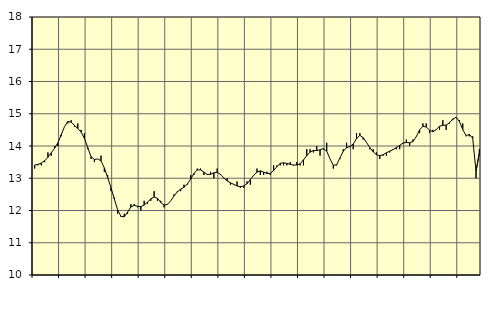
| Category | Piggar | Handel, SNI 45-47 |
|---|---|---|
| nan | 13.3 | 13.41 |
| 87.0 | 13.4 | 13.43 |
| 87.0 | 13.4 | 13.47 |
| 87.0 | 13.5 | 13.54 |
| nan | 13.8 | 13.65 |
| 88.0 | 13.7 | 13.79 |
| 88.0 | 14 | 13.93 |
| 88.0 | 14 | 14.1 |
| nan | 14.3 | 14.35 |
| 89.0 | 14.6 | 14.6 |
| 89.0 | 14.7 | 14.76 |
| 89.0 | 14.8 | 14.74 |
| nan | 14.6 | 14.64 |
| 90.0 | 14.7 | 14.54 |
| 90.0 | 14.5 | 14.43 |
| 90.0 | 14.4 | 14.24 |
| nan | 13.9 | 13.95 |
| 91.0 | 13.6 | 13.67 |
| 91.0 | 13.5 | 13.58 |
| 91.0 | 13.6 | 13.6 |
| nan | 13.7 | 13.54 |
| 92.0 | 13.2 | 13.32 |
| 92.0 | 13.1 | 13.02 |
| 92.0 | 12.6 | 12.71 |
| nan | 12.4 | 12.36 |
| 93.0 | 11.9 | 12.02 |
| 93.0 | 11.8 | 11.82 |
| 93.0 | 11.9 | 11.8 |
| nan | 11.9 | 11.95 |
| 94.0 | 12.2 | 12.11 |
| 94.0 | 12.2 | 12.16 |
| 94.0 | 12.1 | 12.13 |
| nan | 12 | 12.12 |
| 95.0 | 12.3 | 12.17 |
| 95.0 | 12.2 | 12.26 |
| 95.0 | 12.3 | 12.36 |
| nan | 12.6 | 12.42 |
| 96.0 | 12.3 | 12.38 |
| 96.0 | 12.3 | 12.25 |
| 96.0 | 12.1 | 12.17 |
| nan | 12.2 | 12.19 |
| 97.0 | 12.3 | 12.3 |
| 97.0 | 12.5 | 12.45 |
| 97.0 | 12.6 | 12.58 |
| nan | 12.6 | 12.66 |
| 98.0 | 12.8 | 12.72 |
| 98.0 | 12.8 | 12.82 |
| 98.0 | 13.1 | 12.97 |
| nan | 13.1 | 13.15 |
| 99.0 | 13.3 | 13.26 |
| 99.0 | 13.3 | 13.26 |
| 99.0 | 13.1 | 13.19 |
| nan | 13.1 | 13.12 |
| 0.0 | 13.2 | 13.12 |
| 0.0 | 13 | 13.17 |
| 0.0 | 13.3 | 13.18 |
| nan | 13.1 | 13.12 |
| 1.0 | 13 | 13.01 |
| 1.0 | 13 | 12.92 |
| 1.0 | 12.8 | 12.86 |
| nan | 12.8 | 12.81 |
| 2.0 | 12.9 | 12.76 |
| 2.0 | 12.7 | 12.74 |
| 2.0 | 12.7 | 12.76 |
| nan | 12.9 | 12.83 |
| 3.0 | 12.8 | 12.96 |
| 3.0 | 13.1 | 13.09 |
| 3.0 | 13.3 | 13.19 |
| nan | 13.1 | 13.23 |
| 4.0 | 13.1 | 13.19 |
| 4.0 | 13.2 | 13.15 |
| 4.0 | 13.1 | 13.15 |
| nan | 13.4 | 13.24 |
| 5.0 | 13.4 | 13.36 |
| 5.0 | 13.4 | 13.46 |
| 5.0 | 13.4 | 13.48 |
| nan | 13.4 | 13.46 |
| 6.0 | 13.5 | 13.43 |
| 6.0 | 13.4 | 13.41 |
| 6.0 | 13.5 | 13.41 |
| nan | 13.4 | 13.45 |
| 7.0 | 13.4 | 13.57 |
| 7.0 | 13.9 | 13.7 |
| 7.0 | 13.9 | 13.81 |
| nan | 13.8 | 13.86 |
| 8.0 | 14 | 13.86 |
| 8.0 | 13.7 | 13.88 |
| 8.0 | 13.9 | 13.92 |
| nan | 14.1 | 13.84 |
| 9.0 | 13.6 | 13.6 |
| 9.0 | 13.3 | 13.4 |
| 9.0 | 13.4 | 13.42 |
| nan | 13.6 | 13.63 |
| 10.0 | 13.9 | 13.84 |
| 10.0 | 14.1 | 13.95 |
| 10.0 | 14 | 13.98 |
| nan | 13.9 | 14.06 |
| 11.0 | 14.4 | 14.23 |
| 11.0 | 14.4 | 14.33 |
| 11.0 | 14.2 | 14.26 |
| nan | 14.1 | 14.11 |
| 12.0 | 13.9 | 13.95 |
| 12.0 | 13.9 | 13.82 |
| 12.0 | 13.8 | 13.73 |
| nan | 13.6 | 13.7 |
| 13.0 | 13.7 | 13.73 |
| 13.0 | 13.7 | 13.79 |
| 13.0 | 13.8 | 13.84 |
| nan | 13.9 | 13.89 |
| 14.0 | 13.9 | 13.95 |
| 14.0 | 13.9 | 14.02 |
| 14.0 | 14.1 | 14.09 |
| nan | 14.2 | 14.11 |
| 15.0 | 14 | 14.1 |
| 15.0 | 14.2 | 14.14 |
| 15.0 | 14.3 | 14.29 |
| nan | 14.4 | 14.5 |
| 16.0 | 14.7 | 14.61 |
| 16.0 | 14.7 | 14.59 |
| 16.0 | 14.4 | 14.49 |
| nan | 14.5 | 14.44 |
| 17.0 | 14.5 | 14.51 |
| 17.0 | 14.5 | 14.61 |
| 17.0 | 14.8 | 14.64 |
| nan | 14.5 | 14.65 |
| 18.0 | 14.7 | 14.72 |
| 18.0 | 14.8 | 14.84 |
| 18.0 | 14.9 | 14.89 |
| nan | 14.8 | 14.76 |
| 19.0 | 14.7 | 14.51 |
| 19.0 | 14.3 | 14.32 |
| 19.0 | 14.3 | 14.36 |
| nan | 14.3 | 14.24 |
| 20.0 | 13 | 13.22 |
| 20.0 | 13.9 | 13.78 |